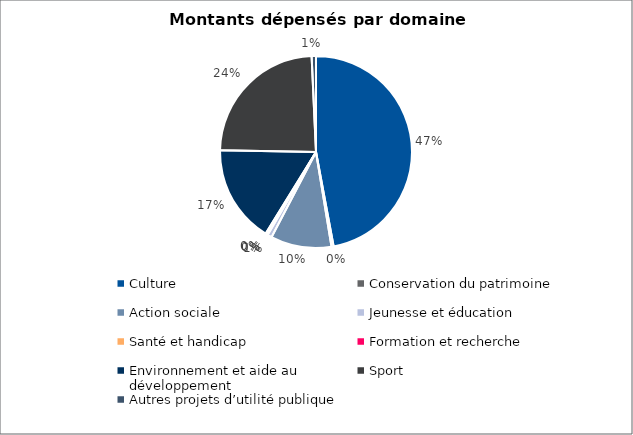
| Category | Series 0 |
|---|---|
| Culture | 20000000 |
| Conservation du patrimoine | 150000 |
| Action sociale | 4356000 |
| Jeunesse et éducation | 316000 |
| Santé et handicap | 50000 |
| Formation et recherche | 120000 |
| Environnement et aide au
développement | 7000000 |
| Sport | 10200000 |
| Autres projets d’utilité publique | 310000 |